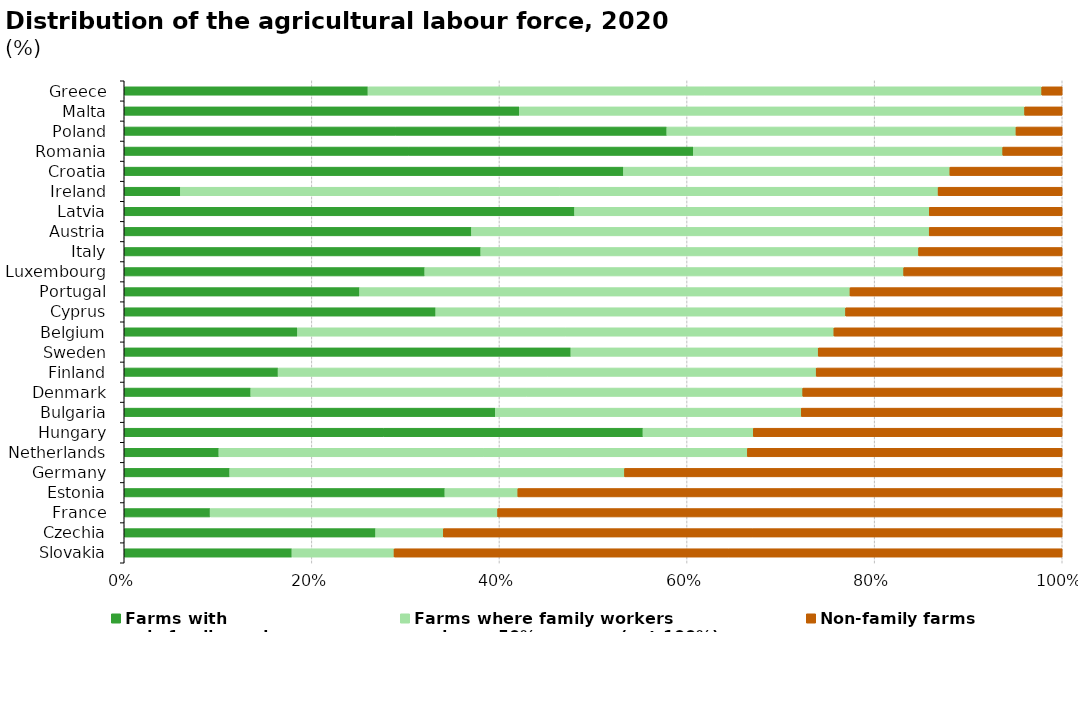
| Category | Farms with 
only family workers | Farms where family workers 
make up 50% or more (not 100%) | Non-family farms |
|---|---|---|---|
| Greece | 25.989 | 71.827 | 2.184 |
| Malta | 42.118 | 53.875 | 4.006 |
| Poland | 57.846 | 37.227 | 4.927 |
| Romania | 60.673 | 32.987 | 6.34 |
| Croatia | 53.225 | 34.801 | 11.975 |
| Ireland | 5.988 | 80.78 | 13.232 |
| Latvia | 48.01 | 37.811 | 14.178 |
| Austria | 37.022 | 48.795 | 14.182 |
| Italy | 38.013 | 46.675 | 15.313 |
| Luxembourg | 32.042 | 51.059 | 16.899 |
| Portugal | 25.092 | 52.284 | 22.623 |
| Cyprus | 33.213 | 43.689 | 23.097 |
| Belgium | 18.475 | 57.186 | 24.339 |
| Sweden | 47.621 | 26.363 | 26.016 |
| Finland | 16.403 | 57.366 | 26.23 |
| Denmark | 13.493 | 58.846 | 27.661 |
| Bulgaria | 39.555 | 32.628 | 27.817 |
| Hungary | 55.307 | 11.759 | 32.934 |
| Netherlands | 10.092 | 56.343 | 33.564 |
| Germany | 11.246 | 42.092 | 46.662 |
| Estonia | 34.189 | 7.777 | 58.034 |
| France | 9.157 | 30.653 | 60.189 |
| Czechia | 26.803 | 7.217 | 65.98 |
| Slovakia | 17.881 | 10.886 | 71.233 |